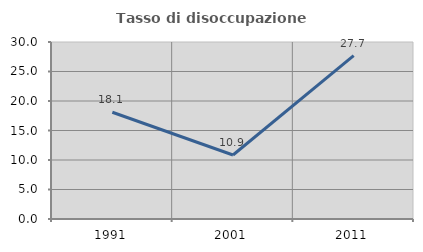
| Category | Tasso di disoccupazione giovanile  |
|---|---|
| 1991.0 | 18.088 |
| 2001.0 | 10.853 |
| 2011.0 | 27.692 |